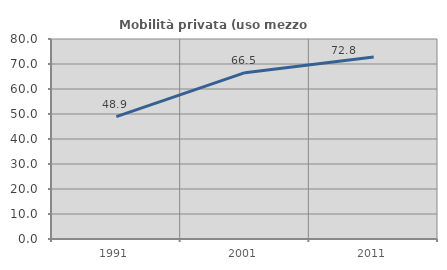
| Category | Mobilità privata (uso mezzo privato) |
|---|---|
| 1991.0 | 48.922 |
| 2001.0 | 66.52 |
| 2011.0 | 72.789 |